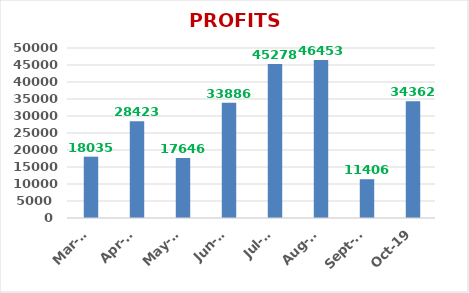
| Category | PROFITS (Rs.) |
|---|---|
| 2019-10-01 | 34362 |
| 2019-09-01 | 11406 |
| 2019-08-01 | 46453 |
| 2019-07-01 | 45278 |
| 2019-06-01 | 33886 |
| 2019-05-01 | 17646 |
| 2019-04-01 | 28423 |
| 2019-03-01 | 18035 |